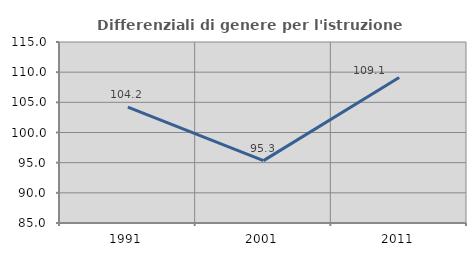
| Category | Differenziali di genere per l'istruzione superiore |
|---|---|
| 1991.0 | 104.197 |
| 2001.0 | 95.341 |
| 2011.0 | 109.127 |